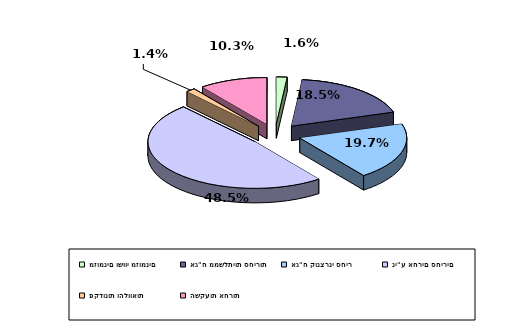
| Category | Series 0 |
|---|---|
| מזומנים ושווי מזומנים | 0.016 |
| אג"ח ממשלתיות סחירות | 0.185 |
| אג"ח קונצרני סחיר | 0.197 |
| ני"ע אחרים סחירים | 0.485 |
| פקדונות והלוואות | 0.014 |
| השקעות אחרות | 0.103 |